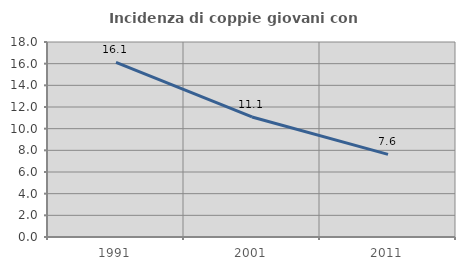
| Category | Incidenza di coppie giovani con figli |
|---|---|
| 1991.0 | 16.125 |
| 2001.0 | 11.079 |
| 2011.0 | 7.627 |